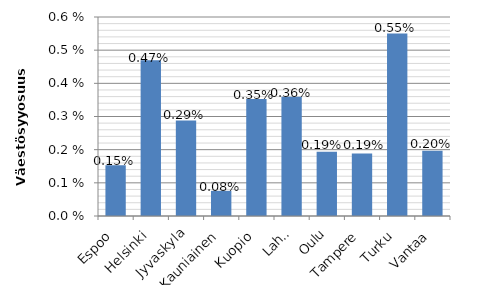
| Category | PAF  |
|---|---|
| Espoo | 0.002 |
| Helsinki | 0.005 |
| Jyvaskyla | 0.003 |
| Kauniainen | 0.001 |
| Kuopio | 0.004 |
| Lahti | 0.004 |
| Oulu | 0.002 |
| Tampere | 0.002 |
| Turku | 0.006 |
| Vantaa | 0.002 |